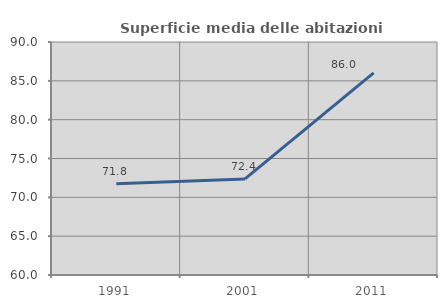
| Category | Superficie media delle abitazioni occupate |
|---|---|
| 1991.0 | 71.75 |
| 2001.0 | 72.374 |
| 2011.0 | 86.021 |